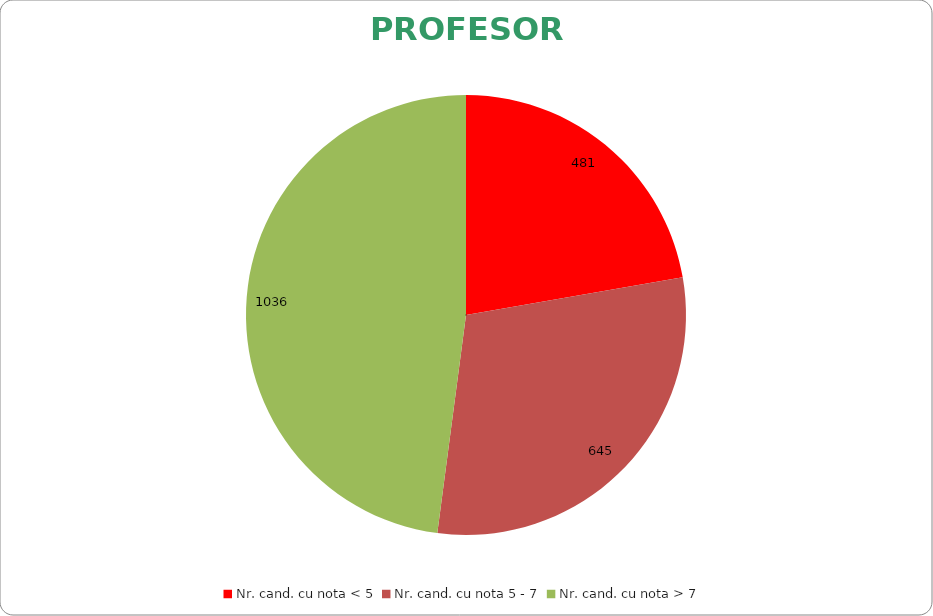
| Category | Series 0 |
|---|---|
| Nr. cand. cu nota < 5 | 481 |
| Nr. cand. cu nota 5 - 7 | 645 |
| Nr. cand. cu nota > 7 | 1036 |